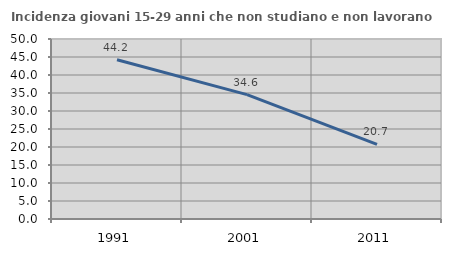
| Category | Incidenza giovani 15-29 anni che non studiano e non lavorano  |
|---|---|
| 1991.0 | 44.22 |
| 2001.0 | 34.551 |
| 2011.0 | 20.714 |